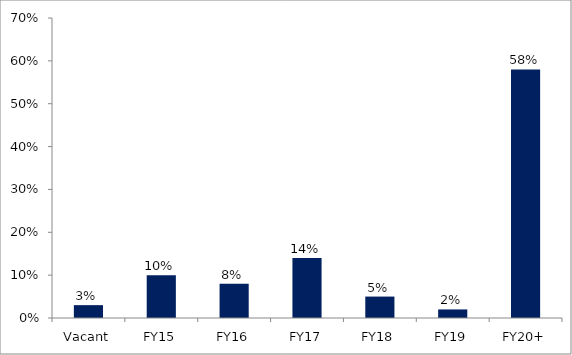
| Category | Series 0 |
|---|---|
| Vacant | 0.03 |
| FY15 | 0.1 |
| FY16 | 0.08 |
| FY17 | 0.14 |
| FY18 | 0.05 |
| FY19 | 0.02 |
| FY20+ | 0.58 |